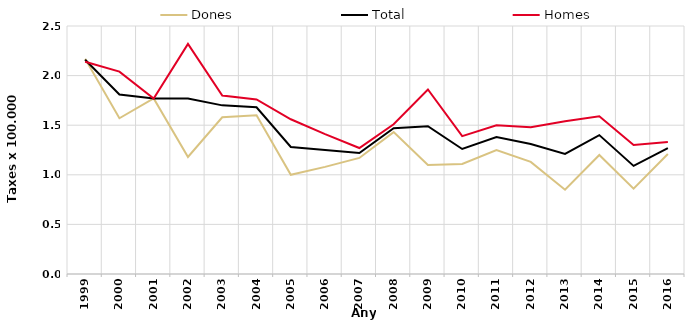
| Category | Dones | Total | Homes |
|---|---|---|---|
| 1999.0 | 2.17 | 2.16 | 2.14 |
| 2000.0 | 1.57 | 1.81 | 2.04 |
| 2001.0 | 1.77 | 1.77 | 1.77 |
| 2002.0 | 1.18 | 1.77 | 2.32 |
| 2003.0 | 1.58 | 1.7 | 1.8 |
| 2004.0 | 1.6 | 1.68 | 1.76 |
| 2005.0 | 1 | 1.28 | 1.56 |
| 2006.0 | 1.08 | 1.25 | 1.41 |
| 2007.0 | 1.17 | 1.22 | 1.27 |
| 2008.0 | 1.43 | 1.47 | 1.51 |
| 2009.0 | 1.1 | 1.49 | 1.86 |
| 2010.0 | 1.11 | 1.26 | 1.39 |
| 2011.0 | 1.25 | 1.38 | 1.5 |
| 2012.0 | 1.13 | 1.31 | 1.48 |
| 2013.0 | 0.85 | 1.21 | 1.54 |
| 2014.0 | 1.2 | 1.4 | 1.59 |
| 2015.0 | 0.86 | 1.09 | 1.3 |
| 2016.0 | 1.21 | 1.27 | 1.33 |